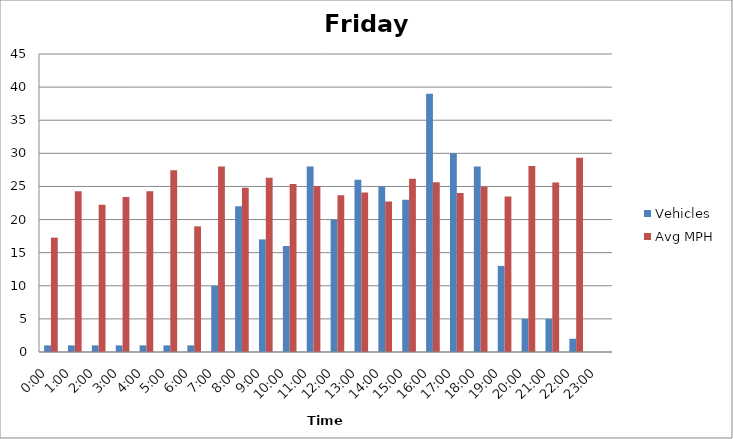
| Category | Vehicles | Avg MPH |
|---|---|---|
| 0:00 | 1 | 17.27 |
| 1:00 | 1 | 24.27 |
| 2:00 | 1 | 22.24 |
| 3:00 | 1 | 23.39 |
| 4:00 | 1 | 24.27 |
| 5:00 | 1 | 27.46 |
| 6:00 | 1 | 18.98 |
| 7:00 | 10 | 28.03 |
| 8:00 | 22 | 24.81 |
| 9:00 | 17 | 26.32 |
| 10:00 | 16 | 25.36 |
| 11:00 | 28 | 25.07 |
| 12:00 | 20 | 23.66 |
| 13:00 | 26 | 24.08 |
| 14:00 | 25 | 22.73 |
| 15:00 | 23 | 26.18 |
| 16:00 | 39 | 25.63 |
| 17:00 | 30 | 24 |
| 18:00 | 28 | 24.97 |
| 19:00 | 13 | 23.48 |
| 20:00 | 5 | 28.07 |
| 21:00 | 5 | 25.6 |
| 22:00 | 2 | 29.32 |
| 23:00 | 0 | 0 |